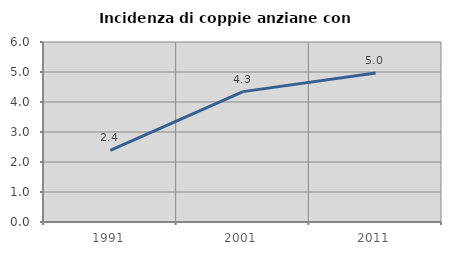
| Category | Incidenza di coppie anziane con figli |
|---|---|
| 1991.0 | 2.384 |
| 2001.0 | 4.346 |
| 2011.0 | 4.967 |